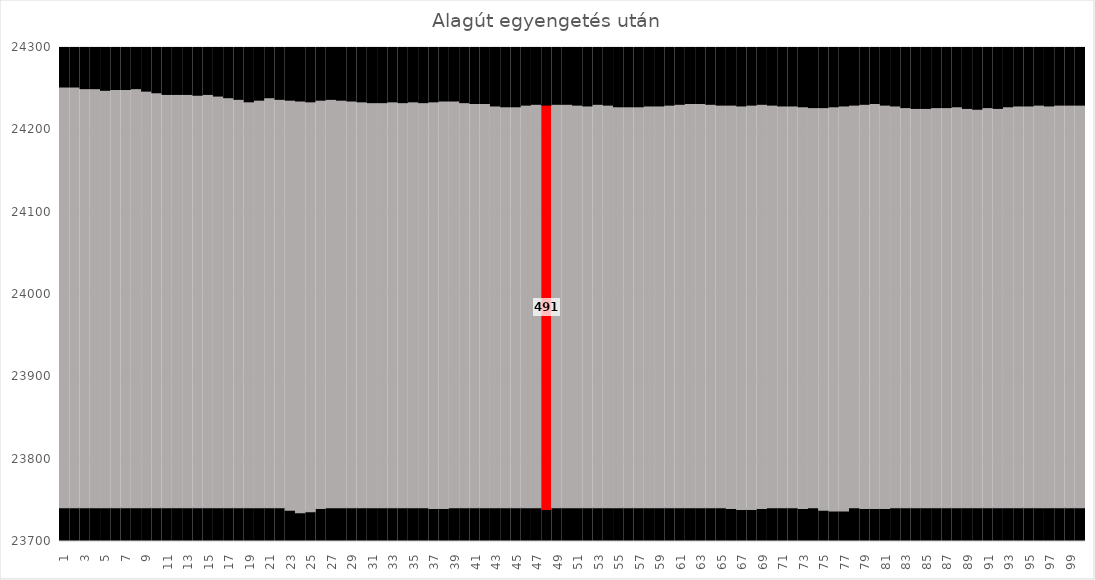
| Category | Alja | Magasság | Teteje |
|---|---|---|---|
| 0 | 23741 | 511 | 248 |
| 1 | 23741 | 511 | 248 |
| 2 | 23741 | 509 | 250 |
| 3 | 23741 | 509 | 250 |
| 4 | 23741 | 507 | 252 |
| 5 | 23741 | 508 | 251 |
| 6 | 23741 | 508 | 251 |
| 7 | 23741 | 509 | 250 |
| 8 | 23741 | 506 | 253 |
| 9 | 23741 | 504 | 255 |
| 10 | 23741 | 502 | 257 |
| 11 | 23741 | 502 | 257 |
| 12 | 23741 | 502 | 257 |
| 13 | 23741 | 501 | 258 |
| 14 | 23741 | 502 | 257 |
| 15 | 23741 | 500 | 259 |
| 16 | 23741 | 498 | 261 |
| 17 | 23741 | 496 | 263 |
| 18 | 23741 | 493 | 266 |
| 19 | 23741 | 495 | 264 |
| 20 | 23741 | 498 | 261 |
| 21 | 23741 | 496 | 263 |
| 22 | 23738 | 498 | 264 |
| 23 | 23735 | 500 | 265 |
| 24 | 23736 | 498 | 266 |
| 25 | 23740 | 496 | 264 |
| 26 | 23741 | 496 | 263 |
| 27 | 23741 | 495 | 264 |
| 28 | 23741 | 494 | 265 |
| 29 | 23741 | 493 | 266 |
| 30 | 23741 | 492 | 267 |
| 31 | 23741 | 492 | 267 |
| 32 | 23741 | 493 | 266 |
| 33 | 23741 | 492 | 267 |
| 34 | 23741 | 493 | 266 |
| 35 | 23741 | 492 | 267 |
| 36 | 23740 | 494 | 266 |
| 37 | 23740 | 495 | 265 |
| 38 | 23741 | 494 | 265 |
| 39 | 23741 | 492 | 267 |
| 40 | 23741 | 491 | 268 |
| 41 | 23741 | 491 | 268 |
| 42 | 23741 | 488 | 271 |
| 43 | 23741 | 487 | 272 |
| 44 | 23741 | 487 | 272 |
| 45 | 23741 | 489 | 270 |
| 46 | 23741 | 490 | 269 |
| 47 | 23739 | 491 | 270 |
| 48 | 23741 | 490 | 269 |
| 49 | 23741 | 490 | 269 |
| 50 | 23741 | 489 | 270 |
| 51 | 23741 | 488 | 271 |
| 52 | 23741 | 490 | 269 |
| 53 | 23741 | 489 | 270 |
| 54 | 23741 | 487 | 272 |
| 55 | 23741 | 487 | 272 |
| 56 | 23741 | 487 | 272 |
| 57 | 23741 | 488 | 271 |
| 58 | 23741 | 488 | 271 |
| 59 | 23741 | 489 | 270 |
| 60 | 23741 | 490 | 269 |
| 61 | 23741 | 491 | 268 |
| 62 | 23741 | 491 | 268 |
| 63 | 23741 | 490 | 269 |
| 64 | 23741 | 489 | 270 |
| 65 | 23740 | 490 | 270 |
| 66 | 23739 | 490 | 271 |
| 67 | 23739 | 491 | 270 |
| 68 | 23740 | 491 | 269 |
| 69 | 23741 | 489 | 270 |
| 70 | 23741 | 488 | 271 |
| 71 | 23741 | 488 | 271 |
| 72 | 23740 | 488 | 272 |
| 73 | 23741 | 486 | 273 |
| 74 | 23738 | 489 | 273 |
| 75 | 23737 | 491 | 272 |
| 76 | 23737 | 492 | 271 |
| 77 | 23741 | 489 | 270 |
| 78 | 23740 | 491 | 269 |
| 79 | 23740 | 492 | 268 |
| 80 | 23740 | 490 | 270 |
| 81 | 23741 | 488 | 271 |
| 82 | 23741 | 486 | 273 |
| 83 | 23741 | 485 | 274 |
| 84 | 23741 | 485 | 274 |
| 85 | 23741 | 486 | 273 |
| 86 | 23741 | 486 | 273 |
| 87 | 23741 | 487 | 272 |
| 88 | 23741 | 485 | 274 |
| 89 | 23741 | 484 | 275 |
| 90 | 23741 | 486 | 273 |
| 91 | 23741 | 485 | 274 |
| 92 | 23741 | 487 | 272 |
| 93 | 23741 | 488 | 271 |
| 94 | 23741 | 488 | 271 |
| 95 | 23741 | 489 | 270 |
| 96 | 23741 | 488 | 271 |
| 97 | 23741 | 489 | 270 |
| 98 | 23741 | 489 | 270 |
| 99 | 23741 | 489 | 270 |